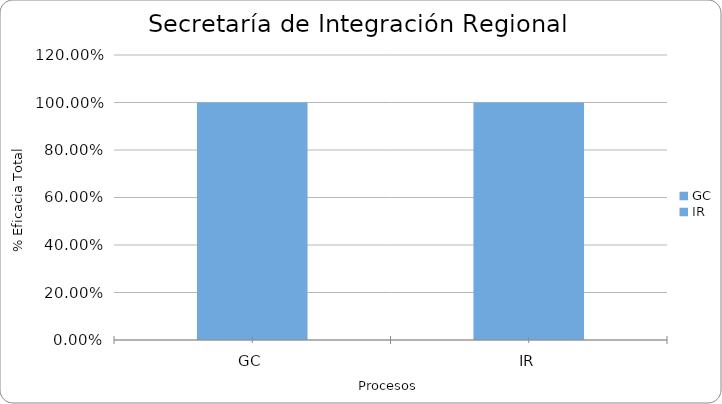
| Category | % Eficacia total |
|---|---|
| GC | 1 |
| IR | 1 |